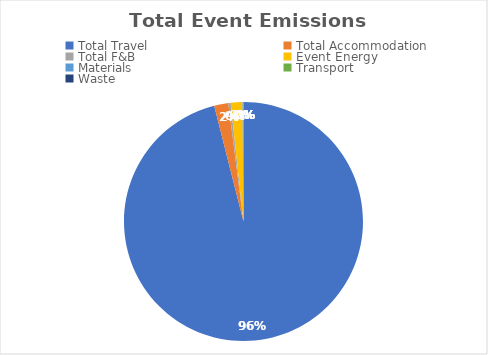
| Category | Series 0 |
|---|---|
| Total Travel | 2713.32 |
| Total Accommodation | 54.11 |
| Total F&B | 8.92 |
| Event Energy | 44.45 |
| Materials | 3.23 |
| Transport | 0.36 |
| Waste | 0.29 |